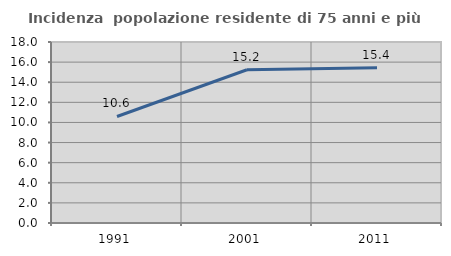
| Category | Incidenza  popolazione residente di 75 anni e più |
|---|---|
| 1991.0 | 10.593 |
| 2001.0 | 15.238 |
| 2011.0 | 15.429 |